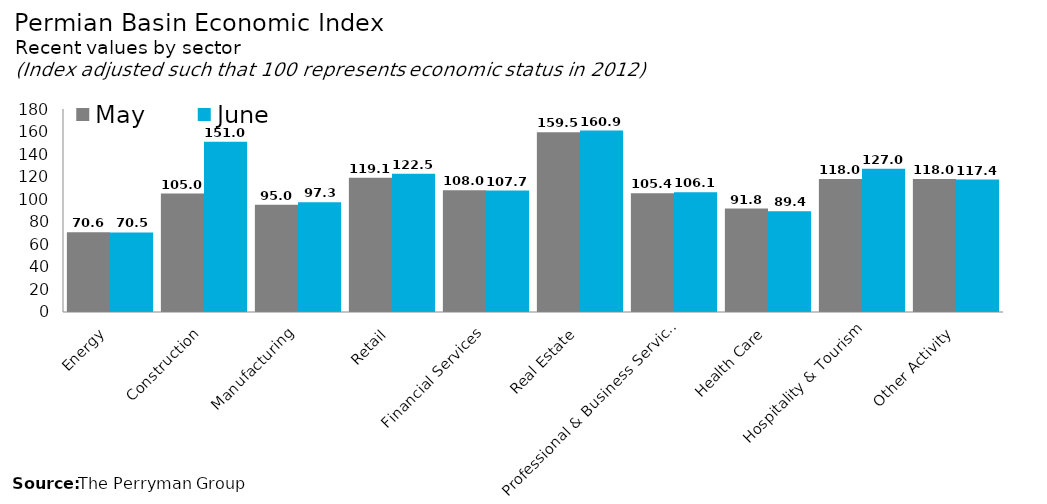
| Category | May | June |
|---|---|---|
| Energy | 70.62 | 70.495 |
| Construction | 105.005 | 151.037 |
| Manufacturing | 95.007 | 97.269 |
| Retail | 119.117 | 122.501 |
| Financial Services | 108.049 | 107.663 |
| Real Estate | 159.457 | 160.889 |
| Professional & Business Services | 105.389 | 106.121 |
| Health Care | 91.759 | 89.446 |
| Hospitality & Tourism | 118.041 | 126.962 |
| Other Activity | 118.023 | 117.388 |